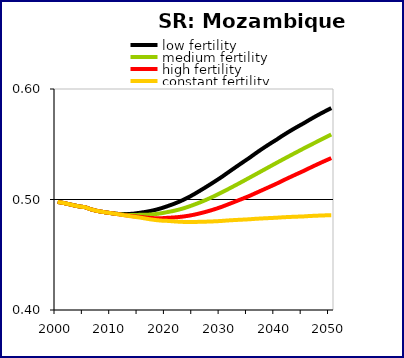
| Category | low fertility | medium fertility | high fertility | constant fertility |
|---|---|---|---|---|
| 2000.0 | 0.498 | 0.498 | 0.498 | 0.498 |
| 2001.0 | 0.497 | 0.497 | 0.497 | 0.497 |
| 2002.0 | 0.496 | 0.496 | 0.496 | 0.496 |
| 2003.0 | 0.495 | 0.495 | 0.495 | 0.495 |
| 2004.0 | 0.494 | 0.494 | 0.494 | 0.494 |
| 2005.0 | 0.493 | 0.493 | 0.493 | 0.493 |
| 2006.0 | 0.491 | 0.491 | 0.491 | 0.491 |
| 2007.0 | 0.49 | 0.49 | 0.49 | 0.49 |
| 2008.0 | 0.489 | 0.489 | 0.489 | 0.489 |
| 2009.0 | 0.488 | 0.488 | 0.488 | 0.488 |
| 2010.0 | 0.487 | 0.487 | 0.487 | 0.487 |
| 2011.0 | 0.487 | 0.487 | 0.487 | 0.487 |
| 2012.0 | 0.487 | 0.486 | 0.486 | 0.486 |
| 2013.0 | 0.487 | 0.486 | 0.485 | 0.485 |
| 2014.0 | 0.487 | 0.486 | 0.485 | 0.484 |
| 2015.0 | 0.488 | 0.486 | 0.484 | 0.484 |
| 2016.0 | 0.489 | 0.486 | 0.484 | 0.483 |
| 2017.0 | 0.49 | 0.486 | 0.483 | 0.482 |
| 2018.0 | 0.491 | 0.487 | 0.483 | 0.481 |
| 2019.0 | 0.492 | 0.488 | 0.483 | 0.481 |
| 2020.0 | 0.494 | 0.489 | 0.483 | 0.481 |
| 2021.0 | 0.496 | 0.489 | 0.484 | 0.48 |
| 2022.0 | 0.498 | 0.491 | 0.484 | 0.48 |
| 2023.0 | 0.5 | 0.492 | 0.485 | 0.48 |
| 2024.0 | 0.502 | 0.494 | 0.485 | 0.48 |
| 2025.0 | 0.505 | 0.495 | 0.486 | 0.48 |
| 2026.0 | 0.508 | 0.497 | 0.487 | 0.48 |
| 2027.0 | 0.511 | 0.499 | 0.489 | 0.48 |
| 2028.0 | 0.514 | 0.502 | 0.49 | 0.48 |
| 2029.0 | 0.517 | 0.504 | 0.492 | 0.48 |
| 2030.0 | 0.52 | 0.506 | 0.493 | 0.481 |
| 2031.0 | 0.524 | 0.509 | 0.495 | 0.481 |
| 2032.0 | 0.527 | 0.512 | 0.497 | 0.481 |
| 2033.0 | 0.531 | 0.514 | 0.499 | 0.482 |
| 2034.0 | 0.534 | 0.517 | 0.501 | 0.482 |
| 2035.0 | 0.538 | 0.52 | 0.503 | 0.482 |
| 2036.0 | 0.541 | 0.522 | 0.505 | 0.482 |
| 2037.0 | 0.545 | 0.525 | 0.508 | 0.483 |
| 2038.0 | 0.548 | 0.528 | 0.51 | 0.483 |
| 2039.0 | 0.551 | 0.53 | 0.512 | 0.483 |
| 2040.0 | 0.554 | 0.533 | 0.514 | 0.484 |
| 2041.0 | 0.557 | 0.536 | 0.517 | 0.484 |
| 2042.0 | 0.561 | 0.538 | 0.519 | 0.484 |
| 2043.0 | 0.564 | 0.541 | 0.521 | 0.484 |
| 2044.0 | 0.566 | 0.544 | 0.524 | 0.485 |
| 2045.0 | 0.569 | 0.546 | 0.526 | 0.485 |
| 2046.0 | 0.572 | 0.549 | 0.528 | 0.485 |
| 2047.0 | 0.575 | 0.551 | 0.531 | 0.485 |
| 2048.0 | 0.578 | 0.554 | 0.533 | 0.485 |
| 2049.0 | 0.58 | 0.556 | 0.535 | 0.486 |
| 2050.0 | 0.583 | 0.559 | 0.537 | 0.486 |